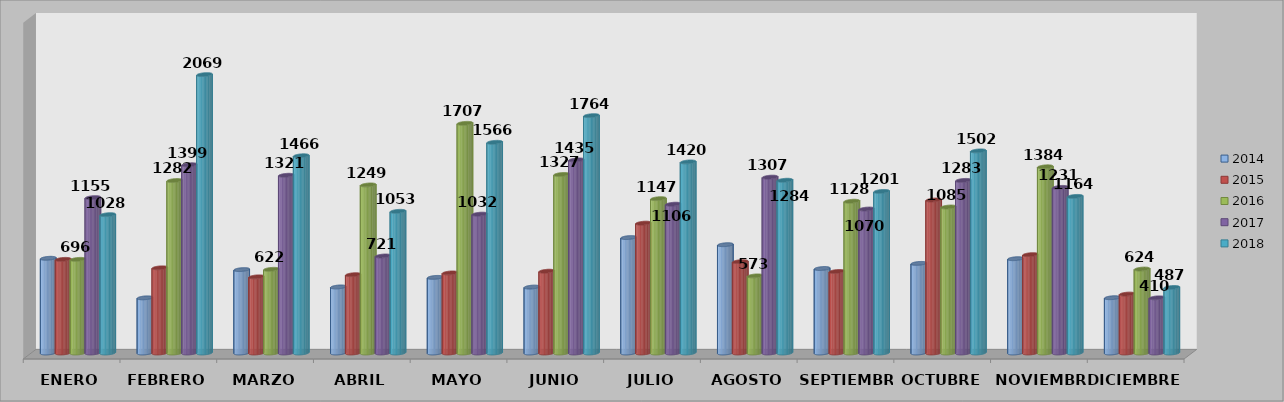
| Category | 2014 | 2015 | 2016 | 2017 | 2018 |
|---|---|---|---|---|---|
| ENERO | 704 | 696 | 696 | 1155 | 1028 |
| FEBRERO | 410 | 633 | 1282 | 1399 | 2069 |
| MARZO | 620 | 566 | 622 | 1321 | 1466 |
| ABRIL | 491 | 582 | 1249 | 721 | 1053 |
| MAYO | 562 | 595 | 1707 | 1032 | 1566 |
| JUNIO | 490 | 608 | 1327 | 1435 | 1764 |
| JULIO | 858 | 965 | 1147 | 1106 | 1420 |
| AGOSTO | 805 | 679 | 573 | 1307 | 1284 |
| SEPTIEMBRE | 628 | 606 | 1128 | 1070 | 1201 |
| OCTUBRE | 666 | 1137 | 1085 | 1283 | 1502 |
| NOVIEMBRE | 701 | 731 | 1384 | 1231 | 1164 |
| DICIEMBRE | 411 | 438 | 624 | 410 | 487 |